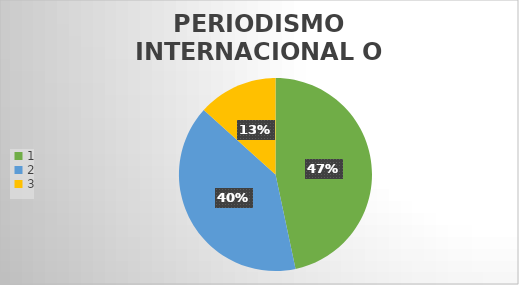
| Category | Series 0 |
|---|---|
| 0 | 7 |
| 1 | 6 |
| 2 | 2 |